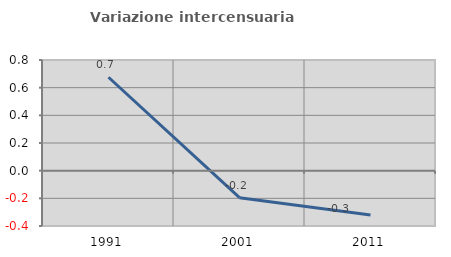
| Category | Variazione intercensuaria annua |
|---|---|
| 1991.0 | 0.675 |
| 2001.0 | -0.195 |
| 2011.0 | -0.321 |